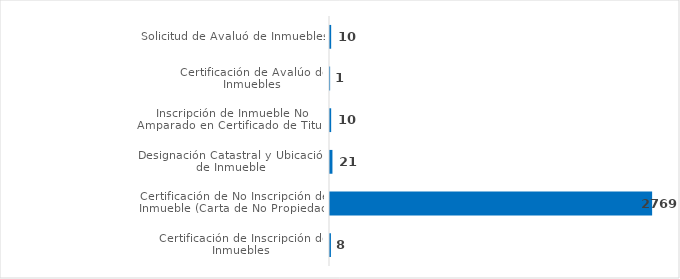
| Category | Series 0 | Series 1 | Series 2 | Series 3 |
|---|---|---|---|---|
| Certificación de Inscripción de Inmuebles |  |  |  | 8 |
| Certificación de No Inscripción de Inmueble (Carta de No Propiedad) |  |  |  | 2769 |
| Designación Catastral y Ubicación de Inmueble |  |  |  | 21 |
| Inscripción de Inmueble No Amparado en Certificado de Titulo |  |  |  | 10 |
| Certificación de Avalúo de Inmuebles |  |  |  | 1 |
| Solicitud de Avaluó de Inmuebles |  |  |  | 10 |